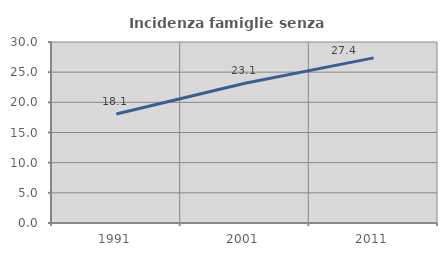
| Category | Incidenza famiglie senza nuclei |
|---|---|
| 1991.0 | 18.061 |
| 2001.0 | 23.149 |
| 2011.0 | 27.368 |